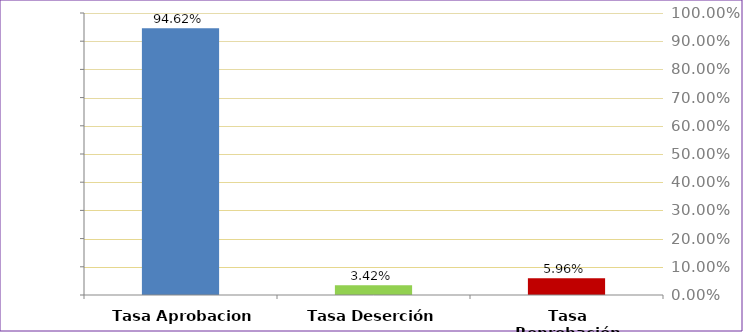
| Category | Total |
|---|---|
| Tasa Aprobacion | 0.946 |
| Tasa Deserción | 0.034 |
| Tasa Reprobación | 0.06 |